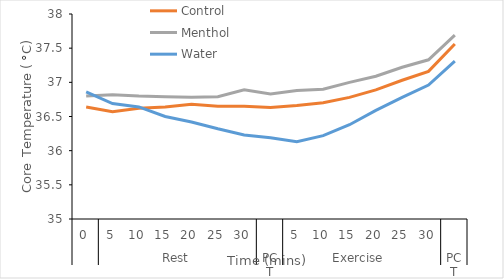
| Category | Control  | Menthol  | Water |
|---|---|---|---|
| 0 | 36.64 | 36.8 | 36.86 |
| 1 | 36.57 | 36.82 | 36.69 |
| 2 | 36.62 | 36.8 | 36.64 |
| 3 | 36.64 | 36.79 | 36.5 |
| 4 | 36.68 | 36.78 | 36.42 |
| 5 | 36.65 | 36.79 | 36.32 |
| 6 | 36.65 | 36.89 | 36.23 |
| 7 | 36.63 | 36.83 | 36.19 |
| 8 | 36.66 | 36.88 | 36.13 |
| 9 | 36.7 | 36.9 | 36.22 |
| 10 | 36.78 | 37 | 36.38 |
| 11 | 36.89 | 37.09 | 36.59 |
| 12 | 37.03 | 37.22 | 36.78 |
| 13 | 37.16 | 37.33 | 36.96 |
| 14 | 37.56 | 37.69 | 37.31 |